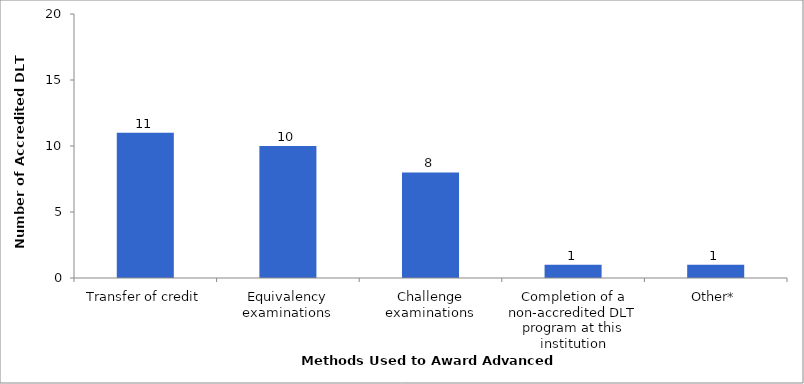
| Category | 2013-14 |
|---|---|
| Transfer of credit | 11 |
| Equivalency examinations | 10 |
| Challenge examinations | 8 |
| Completion of a non-accredited DLT program at this institution | 1 |
| Other* | 1 |